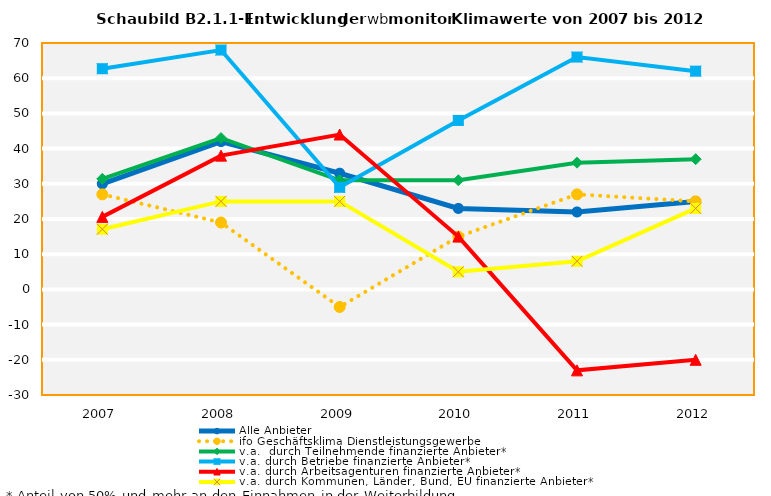
| Category | Alle Anbieter | ifo Geschäftsklima Dienstleistungsgewerbe | v.a.  durch Teilnehmende finanzierte Anbieter* | v.a. durch Betriebe finanzierte Anbieter* | v.a. durch Arbeitsagenturen finanzierte Anbieter* | v.a. durch Kommunen, Länder, Bund, EU finanzierte Anbieter* |
|---|---|---|---|---|---|---|
| 2007.0 | 30 | 27 | 31.4 | 62.7 | 20.6 | 17.1 |
| 2008.0 | 42 | 19 | 43 | 68 | 38 | 25 |
| 2009.0 | 33 | -5 | 31 | 29 | 44 | 25 |
| 2010.0 | 23 | 15 | 31 | 48 | 15 | 5 |
| 2011.0 | 22 | 27 | 36 | 66 | -23 | 8 |
| 2012.0 | 25 | 25 | 37 | 62 | -20 | 23 |